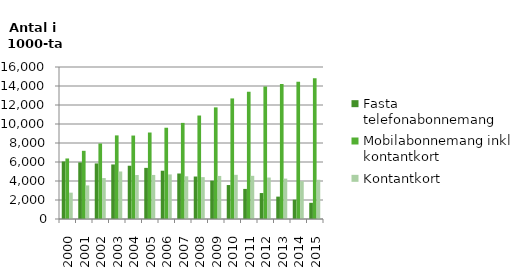
| Category | Fasta telefonabonnemang | Mobilabonnemang inkl. kontantkort | Kontantkort |
|---|---|---|---|
| 2000.0 | 6056 | 6372 | 2773 |
| 2001.0 | 5954 | 7178 | 3536 |
| 2002.0 | 5849 | 7949 | 4309 |
| 2003.0 | 5741 | 8801 | 5003 |
| 2004.0 | 5607 | 8785 | 4629 |
| 2005.0 | 5381 | 9104 | 4638 |
| 2006.0 | 5082 | 9607 | 4693 |
| 2007.0 | 4790 | 10117 | 4496 |
| 2008.0 | 4471 | 10892 | 4407 |
| 2009.0 | 4037 | 11750 | 4532 |
| 2010.0 | 3574 | 12692 | 4651 |
| 2011.0 | 3167 | 13395 | 4545 |
| 2012.0 | 2732 | 13946 | 4365 |
| 2013.0 | 2355.224 | 14199.11 | 4253.348 |
| 2014.0 | 2037 | 14440 | 3984 |
| 2015.0 | 1704 | 14823 | 4128 |